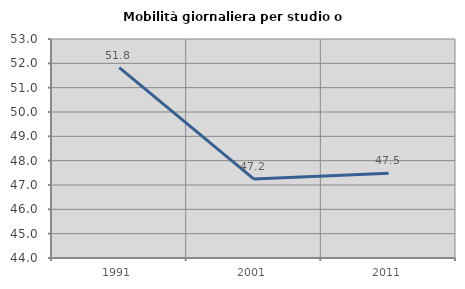
| Category | Mobilità giornaliera per studio o lavoro |
|---|---|
| 1991.0 | 51.82 |
| 2001.0 | 47.244 |
| 2011.0 | 47.48 |